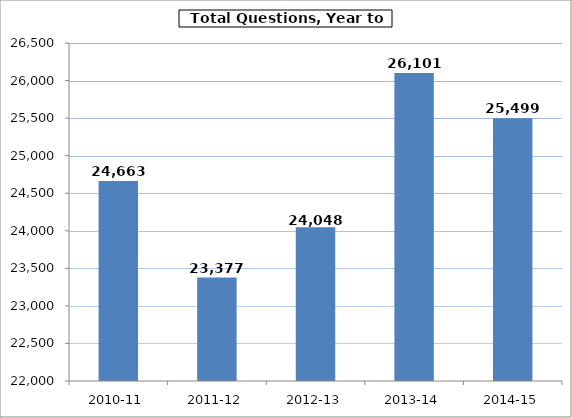
| Category | Series 0 |
|---|---|
| 2010-11 | 24663 |
| 2011-12 | 23377 |
| 2012-13 | 24048 |
| 2013-14 | 26101 |
| 2014-15 | 25499 |